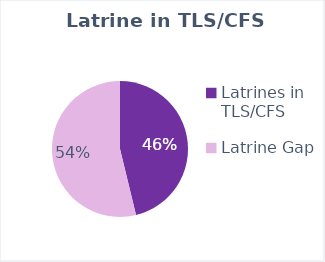
| Category | Series 0 |
|---|---|
| Latrines in TLS/CFS | 214 |
| Latrine Gap | 249.08 |